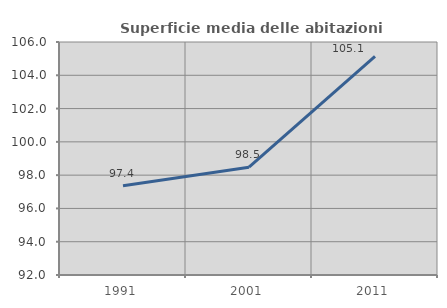
| Category | Superficie media delle abitazioni occupate |
|---|---|
| 1991.0 | 97.366 |
| 2001.0 | 98.477 |
| 2011.0 | 105.136 |